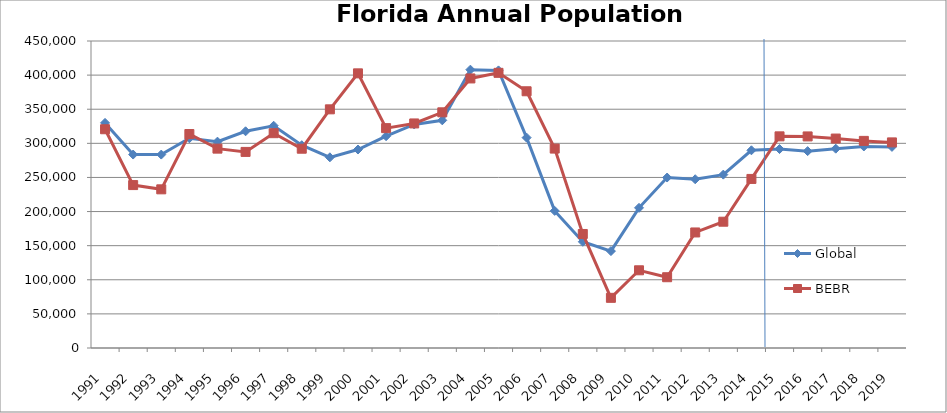
| Category | Global | BEBR |
|---|---|---|
| 1991-01-01 | 329968.968 | 320661 |
| 1992-01-01 | 283545.452 | 238809 |
| 1993-01-01 | 283501.394 | 232574 |
| 1994-01-01 | 307447.366 | 313642 |
| 1995-01-01 | 302478.265 | 292235 |
| 1996-01-01 | 317645.795 | 287429 |
| 1997-01-01 | 325791.4 | 314893 |
| 1998-01-01 | 297257.967 | 292107 |
| 1999-01-01 | 279486.544 | 349823 |
| 2000-01-01 | 290935.291 | 402580 |
| 2001-01-01 | 310468.811 | 322276 |
| 2002-01-01 | 327678.636 | 329156 |
| 2003-01-01 | 333721.032 | 345450 |
| 2004-01-01 | 407984.213 | 395118 |
| 2005-01-01 | 406902.629 | 403332 |
| 2006-01-01 | 308348.481 | 376319 |
| 2007-01-01 | 200979.038 | 292293 |
| 2008-01-01 | 155700.195 | 167137 |
| 2009-01-01 | 142024.154 | 73520 |
| 2010-01-01 | 205475.505 | 113907 |
| 2011-01-01 | 249864.777 | 103738 |
| 2012-01-01 | 247376.107 | 169364 |
| 2013-01-01 | 254118.422 | 185109 |
| 2014-01-01 | 289772.58 | 247826 |
| 2015-01-01 | 291604.567 | 310227 |
| 2016-01-01 | 288579.815 | 310127 |
| 2017-01-01 | 292166.402 | 307008 |
| 2018-01-01 | 295422.858 | 303597 |
| 2019-01-01 | 294782.489 | 301381 |